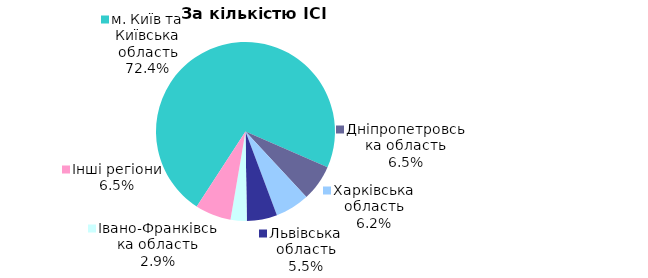
| Category | Series 0 |
|---|---|
| м. Київ та Київська область | 0.724 |
| Дніпропетровська область | 0.065 |
| Харківська область | 0.062 |
| Львівська область | 0.055 |
| Iвано-Франкiвська область | 0.029 |
| Інші регіони | 0.065 |